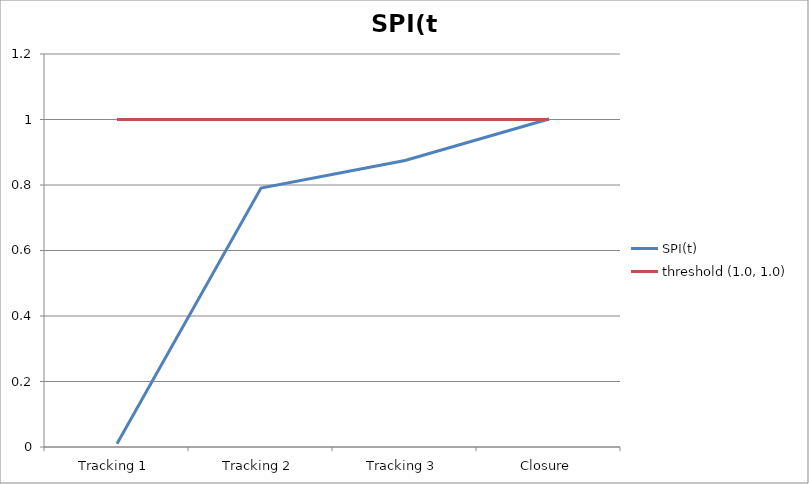
| Category | SPI(t) | threshold (1.0, 1.0) |
|---|---|---|
| Tracking 1 | 0.01 | 1 |
| Tracking 2 | 0.791 | 1 |
| Tracking 3 | 0.875 | 1 |
| Closure | 1.002 | 1 |